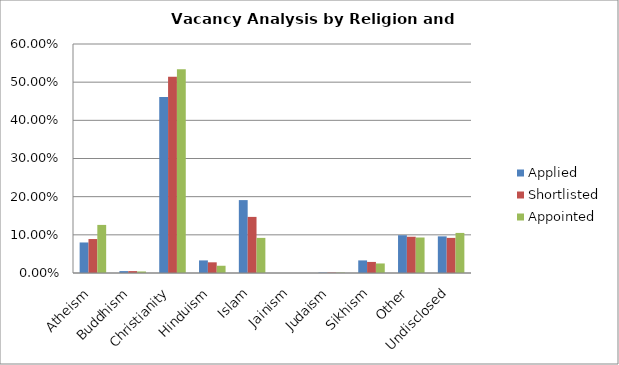
| Category | Applied | Shortlisted | Appointed |
|---|---|---|---|
| Atheism | 0.08 | 0.089 | 0.126 |
| Buddhism | 0.005 | 0.005 | 0.004 |
| Christianity | 0.461 | 0.514 | 0.534 |
| Hinduism | 0.033 | 0.028 | 0.019 |
| Islam | 0.191 | 0.147 | 0.092 |
| Jainism | 0 | 0 | 0 |
| Judaism | 0.001 | 0.001 | 0.001 |
| Sikhism | 0.033 | 0.029 | 0.025 |
| Other | 0.099 | 0.095 | 0.093 |
| Undisclosed | 0.096 | 0.092 | 0.105 |